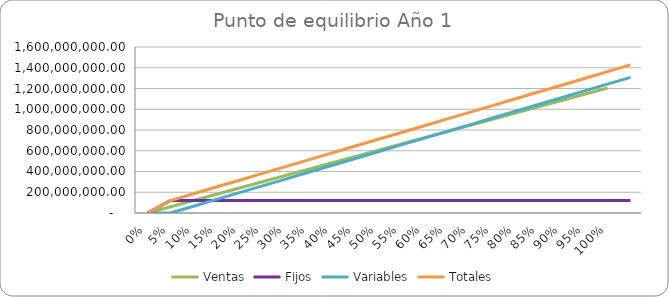
| Category | Ventas | Fijos | Variables | Totales |
|---|---|---|---|---|
| 0.0 | 0 | 0 | 0 | 0 |
| 0.05 | 60243750 | 119965080.987 | 0 | 119965080.987 |
| 0.1 | 120487500 | 119965080.987 | 65377307.347 | 185342388.334 |
| 0.15 | 180731250 | 119965080.987 | 130754614.694 | 250719695.681 |
| 0.2 | 240975000 | 119965080.987 | 196131922.041 | 316097003.028 |
| 0.25 | 301218750 | 119965080.987 | 261509229.389 | 381474310.375 |
| 0.3 | 361462500 | 119965080.987 | 326886536.736 | 446851617.722 |
| 0.35 | 421706250 | 119965080.987 | 392263844.083 | 512228925.069 |
| 0.4 | 481950000 | 119965080.987 | 457641151.43 | 577606232.417 |
| 0.45 | 542193750 | 119965080.987 | 523018458.777 | 642983539.764 |
| 0.5 | 602437500 | 119965080.987 | 588395766.124 | 708360847.111 |
| 0.55 | 662681250 | 119965080.987 | 653773073.471 | 773738154.458 |
| 0.6 | 722925000 | 119965080.987 | 719150380.819 | 839115461.805 |
| 0.65 | 783168750 | 119965080.987 | 784527688.166 | 904492769.152 |
| 0.7 | 843412500 | 119965080.987 | 849904995.513 | 969870076.499 |
| 0.75 | 903656250 | 119965080.987 | 915282302.86 | 1035247383.847 |
| 0.8 | 963900000 | 119965080.987 | 980659610.207 | 1100624691.194 |
| 0.85 | 1024143750 | 119965080.987 | 1046036917.554 | 1166001998.541 |
| 0.9 | 1084387500 | 119965080.987 | 1111414224.901 | 1231379305.888 |
| 0.95 | 1144631250 | 119965080.987 | 1176791532.249 | 1296756613.235 |
| 1.0 | 1204875000 | 119965080.987 | 1242168839.596 | 1362133920.582 |